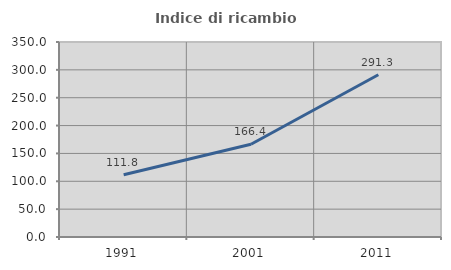
| Category | Indice di ricambio occupazionale  |
|---|---|
| 1991.0 | 111.84 |
| 2001.0 | 166.381 |
| 2011.0 | 291.267 |